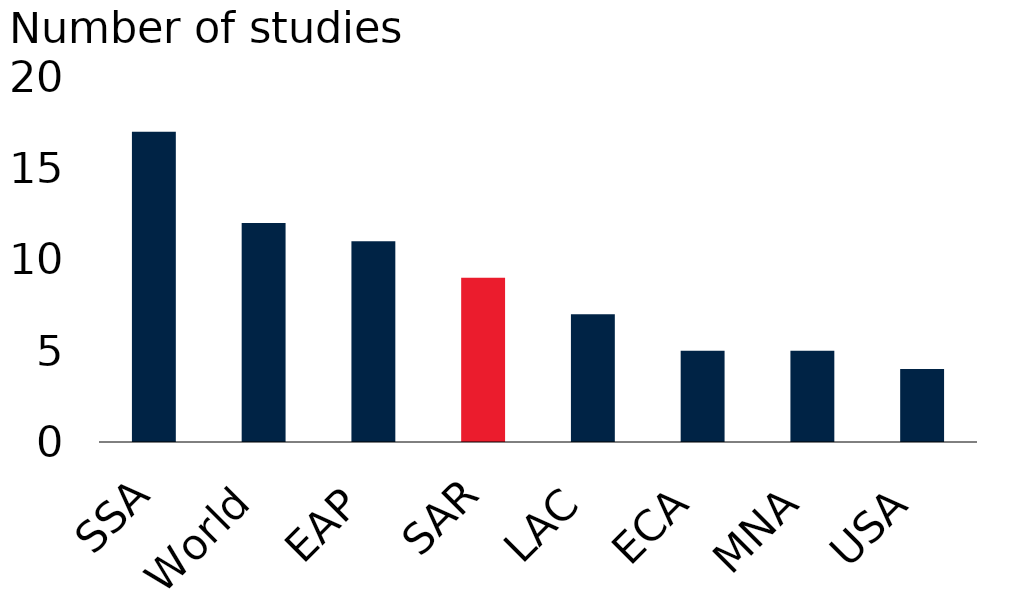
| Category | Series 0 |
|---|---|
| SSA | 17 |
| World | 12 |
| EAP | 11 |
| SAR | 9 |
| LAC | 7 |
| ECA | 5 |
| MNA | 5 |
| USA | 4 |